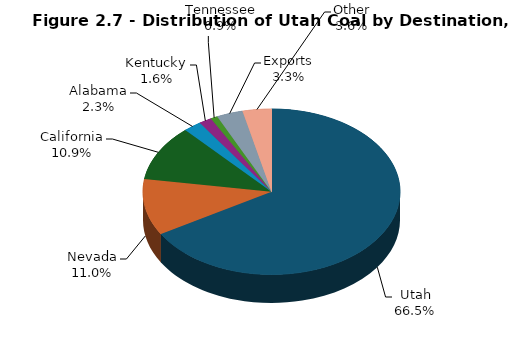
| Category | Series 0 |
|---|---|
| Utah | 12779 |
| Nevada | 2107 |
| California | 2094 |
| Alabama | 433 |
| Kentucky | 308 |
| Tennessee | 169 |
| Exports | 634.1 |
| Other | 697 |